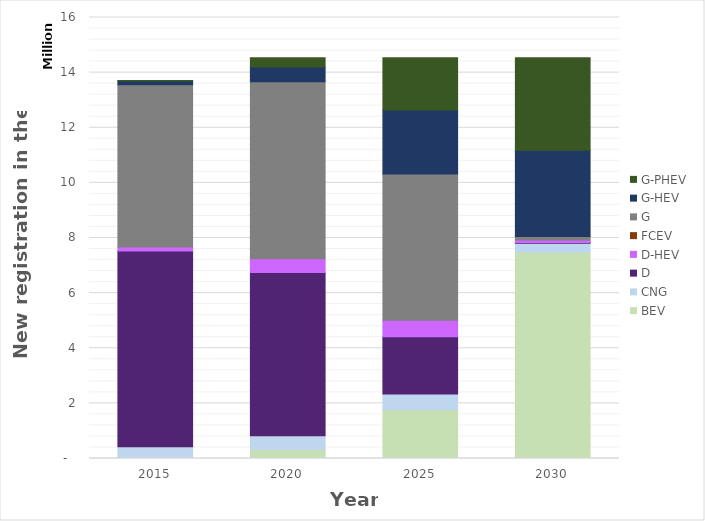
| Category | BEV | CNG | D | D-HEV | FCEV | G | G-HEV | G-PHEV |
|---|---|---|---|---|---|---|---|---|
| 2015.0 | 30412.944 | 400318.274 | 7101302.123 | 138746.312 | 0 | 5891917.78 | 131598.511 | 19230.056 |
| 2020.0 | 329780.381 | 495572.356 | 5920980.981 | 502951.656 | 0 | 6416898.339 | 537517.884 | 337418.402 |
| 2025.0 | 1772826.043 | 567117.442 | 2076934.967 | 598135.045 | 0 | 5309850.182 | 2315259.033 | 1900997.288 |
| 2030.0 | 7480282.218 | 328924.876 | 24436.972 | 97448.298 | 0 | 123605.033 | 3126183.291 | 3360239.313 |